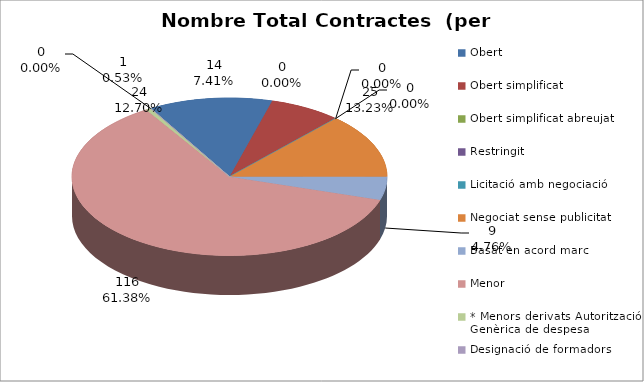
| Category | Nombre Total Contractes |
|---|---|
| Obert | 24 |
| Obert simplificat | 14 |
| Obert simplificat abreujat | 0 |
| Restringit | 0 |
| Licitació amb negociació | 0 |
| Negociat sense publicitat | 25 |
| Basat en acord marc | 9 |
| Menor | 116 |
| * Menors derivats Autorització Genèrica de despesa | 1 |
| Designació de formadors | 0 |